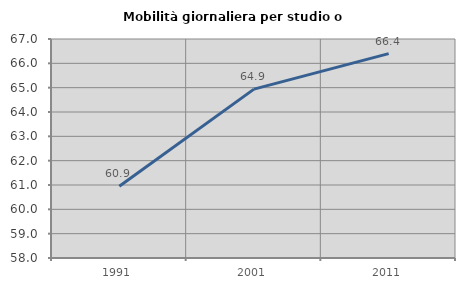
| Category | Mobilità giornaliera per studio o lavoro |
|---|---|
| 1991.0 | 60.947 |
| 2001.0 | 64.939 |
| 2011.0 | 66.399 |